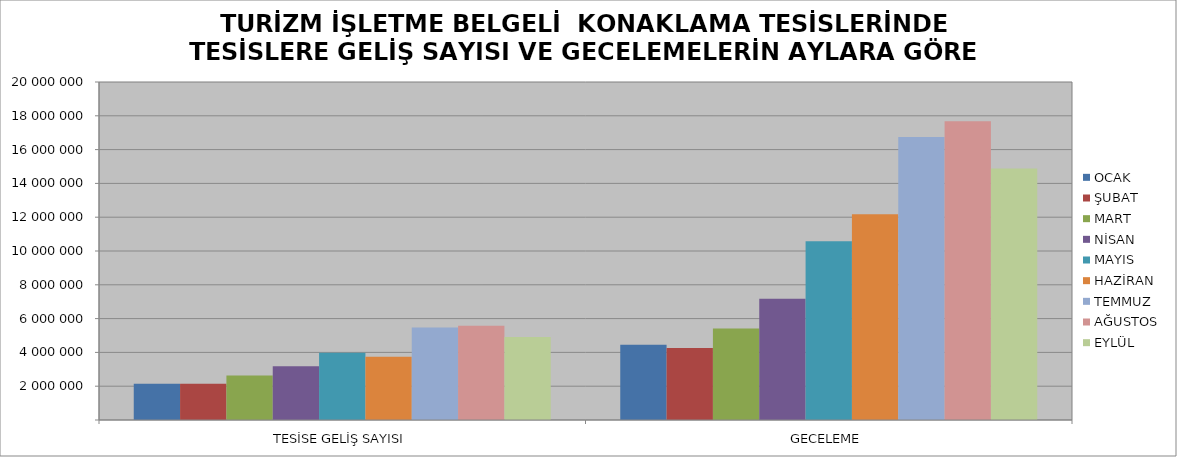
| Category | OCAK | ŞUBAT | MART | NİSAN | MAYIS | HAZİRAN | TEMMUZ | AĞUSTOS | EYLÜL |
|---|---|---|---|---|---|---|---|---|---|
| TESİSE GELİŞ SAYISI | 2146994 | 2141043 | 2629734 | 3173381 | 3978651 | 3742131 | 5470767 | 5580002 | 4908503 |
| GECELEME | 4457352 | 4260377 | 5413903 | 7176325 | 10579158 | 12172370 | 16748728 | 17679357 | 14883465 |